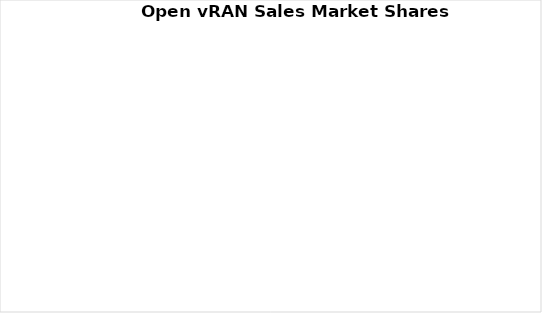
| Category | 2021 |
|---|---|
| Altiostar | 0 |
| Ericsson | 0 |
| Fujitsu | 0 |
| Mavenir | 0 |
| Nokia | 0 |
| NEC | 0 |
| Parallel Wireless | 0 |
| Samsung | 0 |
| Other | 0 |